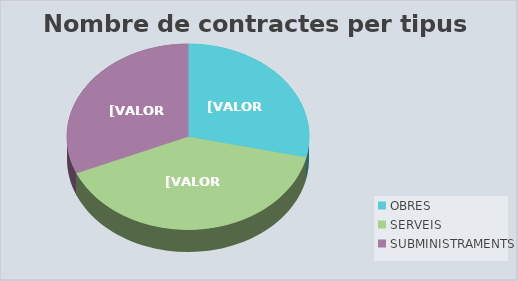
| Category | Series 0 | Series 1 |
|---|---|---|
| OBRES | 10 | 2706775.45 |
| SERVEIS | 14 | 254828.68 |
| SUBMINISTRAMENTS | 11 | 2737254.86 |